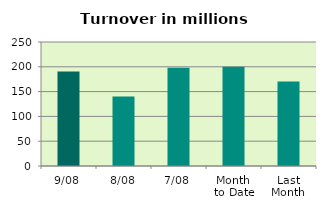
| Category | Series 0 |
|---|---|
| 9/08 | 190.761 |
| 8/08 | 140.27 |
| 7/08 | 198.309 |
| Month 
to Date | 199.949 |
| Last
Month | 170.387 |